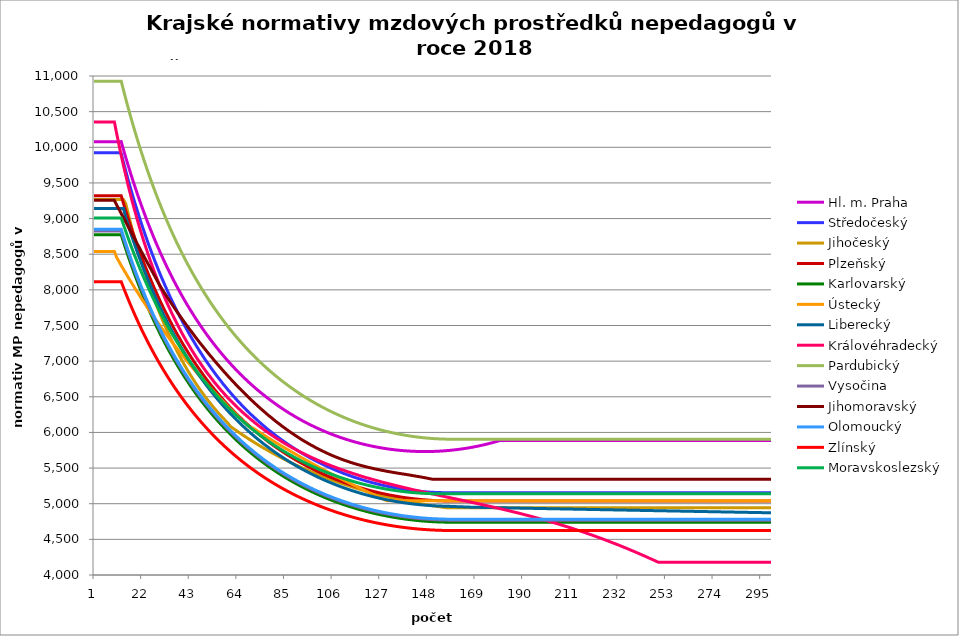
| Category | Hl. m. Praha | Středočeský | Jihočeský | Plzeňský | Karlovarský  | Ústecký   | Liberecký | Královéhradecký | Pardubický | Vysočina | Jihomoravský | Olomoucký | Zlínský | Moravskoslezský |
|---|---|---|---|---|---|---|---|---|---|---|---|---|---|---|
| 0 | 10077.971 | 9924.868 | 9267.509 | 9319.805 | 8772.707 | 8539.437 | 9142.389 | 10353.778 | 10927.718 | 8826.407 | 9255.688 | 8851.852 | 8115.046 | 9009.103 |
| 1 | 10077.971 | 9924.868 | 9267.509 | 9319.805 | 8772.707 | 8539.437 | 9142.389 | 10353.778 | 10927.718 | 8826.407 | 9255.688 | 8851.852 | 8115.046 | 9009.103 |
| 2 | 10077.971 | 9924.868 | 9267.509 | 9319.805 | 8772.707 | 8539.437 | 9142.389 | 10353.778 | 10927.718 | 8826.407 | 9255.688 | 8851.852 | 8115.046 | 9009.103 |
| 3 | 10077.971 | 9924.868 | 9267.509 | 9319.805 | 8772.707 | 8539.437 | 9142.389 | 10353.778 | 10927.718 | 8826.407 | 9255.688 | 8851.852 | 8115.046 | 9009.103 |
| 4 | 10077.971 | 9924.868 | 9267.509 | 9319.805 | 8772.707 | 8539.437 | 9142.389 | 10353.778 | 10927.718 | 8826.407 | 9255.688 | 8851.852 | 8115.046 | 9009.103 |
| 5 | 10077.971 | 9924.868 | 9267.509 | 9319.805 | 8772.707 | 8539.437 | 9142.389 | 10353.778 | 10927.718 | 8826.407 | 9255.688 | 8851.852 | 8115.046 | 9009.103 |
| 6 | 10077.971 | 9924.868 | 9267.509 | 9319.805 | 8772.707 | 8539.437 | 9142.389 | 10353.778 | 10927.718 | 8826.407 | 9255.688 | 8851.852 | 8115.046 | 9009.103 |
| 7 | 10077.971 | 9924.868 | 9267.509 | 9319.805 | 8772.707 | 8539.437 | 9142.389 | 10353.778 | 10927.718 | 8826.407 | 9255.688 | 8851.852 | 8115.046 | 9009.103 |
| 8 | 10077.971 | 9924.868 | 9267.509 | 9319.805 | 8772.707 | 8539.437 | 9142.389 | 10353.778 | 10927.718 | 8826.407 | 9255.688 | 8851.852 | 8115.046 | 9009.103 |
| 9 | 10077.971 | 9924.868 | 9267.509 | 9319.805 | 8772.707 | 8539.437 | 9142.389 | 10353.778 | 10927.718 | 8826.407 | 9255.688 | 8851.852 | 8115.046 | 9009.103 |
| 10 | 10077.971 | 9924.868 | 9267.509 | 9319.805 | 8772.707 | 8453.856 | 9142.389 | 10192.708 | 10927.718 | 8826.407 | 9189.381 | 8851.852 | 8115.046 | 9009.103 |
| 11 | 10077.971 | 9924.868 | 9267.509 | 9319.805 | 8772.707 | 8398.961 | 9142.389 | 10036.573 | 10927.718 | 8826.407 | 9131.658 | 8851.852 | 8115.046 | 9009.103 |
| 12 | 10079.675 | 9911.757 | 9267.509 | 9319.805 | 8772.785 | 8341.187 | 9142.47 | 9885.149 | 10927.815 | 8826.407 | 9070.882 | 8851.852 | 8115.046 | 9007.748 |
| 13 | 9967.203 | 9786.783 | 9267.509 | 9213.666 | 8672.115 | 8287.74 | 9142.574 | 9742.751 | 10802.416 | 8725.123 | 9010.909 | 8747.712 | 8032.29 | 8913.102 |
| 14 | 9858.029 | 9669.072 | 9210.044 | 9109.918 | 8574.398 | 8234.975 | 9013.791 | 9608.799 | 10680.694 | 8626.884 | 8951.724 | 8649.72 | 7951.757 | 8821.077 |
| 15 | 9752.018 | 9550.106 | 9078.972 | 9008.48 | 8479.512 | 8179.427 | 8913.181 | 9474.198 | 10562.5 | 8531.563 | 8889.686 | 8553.899 | 7873.363 | 8731.57 |
| 16 | 9649.044 | 9437.987 | 8952.877 | 8909.276 | 8387.343 | 8128.027 | 8815.47 | 9347.481 | 10447.689 | 8438.683 | 8832.078 | 8460.177 | 7797.03 | 8644.487 |
| 17 | 9548.987 | 9328.471 | 8831.502 | 8815.926 | 8297.781 | 8077.269 | 8720.542 | 9224.109 | 10336.127 | 8348.504 | 8771.681 | 8371.977 | 7722.683 | 8559.737 |
| 18 | 9451.733 | 9221.467 | 8714.604 | 8724.513 | 8210.725 | 8023.821 | 8628.285 | 9107.906 | 10227.686 | 8260.916 | 8712.105 | 8282.178 | 7650.251 | 8477.234 |
| 19 | 9357.174 | 9120.583 | 8601.96 | 8634.975 | 8126.077 | 7974.353 | 8538.596 | 8994.595 | 10122.244 | 8175.819 | 8649.901 | 8197.632 | 7579.666 | 8396.897 |
| 20 | 9265.209 | 9018.269 | 8493.359 | 8547.257 | 8043.745 | 7925.49 | 8451.376 | 8884.068 | 10019.687 | 8093.114 | 8591.962 | 8114.794 | 7510.864 | 8318.648 |
| 21 | 9175.74 | 8921.76 | 8388.608 | 8461.303 | 7963.641 | 7874.026 | 8366.529 | 8779.899 | 9919.905 | 8012.388 | 8531.455 | 8033.613 | 7443.783 | 8242.412 |
| 22 | 9088.676 | 8827.294 | 8287.522 | 8377.061 | 7885.682 | 7826.382 | 8283.968 | 8678.146 | 9822.795 | 7933.888 | 8471.795 | 7957.194 | 7378.364 | 8168.119 |
| 23 | 9003.928 | 8734.808 | 8189.931 | 8297.751 | 7809.788 | 7779.31 | 8203.608 | 8582.235 | 9728.259 | 7857.532 | 8412.963 | 7879.121 | 7314.552 | 8095.703 |
| 24 | 8921.414 | 8644.24 | 8095.673 | 8219.93 | 7735.886 | 7729.721 | 8125.368 | 8484.986 | 9636.202 | 7783.239 | 8354.943 | 7805.599 | 7252.293 | 8025.098 |
| 25 | 8841.054 | 8558.783 | 8004.599 | 8143.554 | 7663.903 | 7683.802 | 8049.171 | 8393.275 | 9546.537 | 7710.935 | 8297.717 | 7733.436 | 7191.536 | 7956.244 |
| 26 | 8762.773 | 8475 | 7916.567 | 8068.585 | 7593.772 | 7638.425 | 7974.944 | 8306.815 | 9459.178 | 7640.255 | 8238.156 | 7662.595 | 7132.232 | 7889.082 |
| 27 | 8686.499 | 8392.841 | 7831.445 | 7994.983 | 7525.427 | 7590.61 | 7902.619 | 8218.895 | 9374.044 | 7571.434 | 8179.445 | 7593.041 | 7074.335 | 7823.557 |
| 28 | 8612.164 | 8312.26 | 7749.107 | 7925.697 | 7458.807 | 7546.324 | 7832.129 | 8139.13 | 9291.059 | 7504.407 | 8121.564 | 7524.738 | 7017.799 | 7759.616 |
| 29 | 8539.701 | 8233.211 | 7669.435 | 7854.668 | 7393.853 | 7502.552 | 7763.411 | 8057.802 | 9210.15 | 7439.113 | 8061.516 | 7460.424 | 6962.583 | 7697.208 |
| 30 | 8469.05 | 8158.608 | 7592.32 | 7787.782 | 7330.51 | 7456.418 | 7696.406 | 7981.119 | 9131.246 | 7375.491 | 8011.168 | 7394.475 | 6908.645 | 7636.283 |
| 31 | 8400.15 | 8085.345 | 7517.656 | 7722.026 | 7268.722 | 7413.68 | 7631.055 | 7905.882 | 9054.28 | 7313.216 | 7961.446 | 7332.359 | 6855.947 | 7576.796 |
| 32 | 8332.945 | 8013.386 | 7445.345 | 7660.16 | 7208.44 | 7371.429 | 7567.303 | 7832.051 | 8979.19 | 7252.512 | 7912.337 | 7271.279 | 6804.45 | 7518.702 |
| 33 | 8267.38 | 7942.696 | 7375.293 | 7596.533 | 7149.615 | 7326.888 | 7505.1 | 7762.458 | 8905.914 | 7193.327 | 7863.83 | 7213.798 | 6754.119 | 7461.958 |
| 34 | 8203.403 | 7873.242 | 7307.413 | 7536.654 | 7092.199 | 7285.618 | 7444.394 | 7694.092 | 8834.393 | 7135.611 | 7815.914 | 7154.669 | 6704.919 | 7406.523 |
| 35 | 8140.964 | 7807.7 | 7241.62 | 7475.053 | 7036.147 | 7244.81 | 7385.138 | 7626.919 | 8764.573 | 7079.318 | 7768.579 | 7099.01 | 6656.817 | 7352.359 |
| 36 | 8080.017 | 7740.578 | 7177.838 | 7417.066 | 6981.418 | 7201.782 | 7327.286 | 7563.636 | 8696.4 | 7024.153 | 7721.813 | 7044.211 | 6609.782 | 7299.426 |
| 37 | 8020.515 | 7677.217 | 7115.989 | 7359.972 | 6927.97 | 7161.905 | 7270.795 | 7501.395 | 8629.822 | 6970.329 | 7675.607 | 6990.251 | 6563.782 | 7247.691 |
| 38 | 7962.415 | 7617.462 | 7056.005 | 7306.287 | 6875.764 | 7122.467 | 7215.623 | 7440.17 | 8564.792 | 6917.804 | 7629.951 | 6937.111 | 6518.789 | 7197.117 |
| 39 | 7905.674 | 7556.093 | 6997.817 | 7250.879 | 6824.762 | 7080.876 | 7161.728 | 7379.937 | 8501.261 | 6866.538 | 7584.835 | 6884.774 | 6474.774 | 7147.672 |
| 40 | 7850.254 | 7495.704 | 6941.361 | 7198.768 | 6774.929 | 7042.323 | 7109.074 | 7323.227 | 8439.186 | 6816.493 | 7540.249 | 6835.546 | 6431.71 | 7099.323 |
| 41 | 7796.115 | 7438.731 | 6886.578 | 7147.401 | 6726.229 | 7001.66 | 7057.623 | 7267.383 | 8378.524 | 6767.402 | 7496.184 | 6787.018 | 6389.572 | 7052.041 |
| 42 | 7743.221 | 7382.617 | 6833.41 | 7096.761 | 6678.63 | 6963.963 | 7007.339 | 7214.866 | 8319.232 | 6719.466 | 7455.179 | 6736.913 | 6348.333 | 7005.795 |
| 43 | 7691.536 | 7327.344 | 6781.803 | 7046.834 | 6632.099 | 6926.669 | 6958.189 | 7160.656 | 8261.271 | 6672.651 | 7412.101 | 6692 | 6307.971 | 6960.557 |
| 44 | 7641.026 | 7275.242 | 6731.703 | 6997.605 | 6586.607 | 6887.327 | 6910.141 | 7109.664 | 8204.604 | 6626.925 | 7369.517 | 6645.482 | 6268.461 | 6916.3 |
| 45 | 7591.658 | 7221.559 | 6683.062 | 6951.355 | 6542.124 | 6850.847 | 6863.162 | 7059.394 | 8149.193 | 6582.257 | 7327.419 | 6599.606 | 6229.781 | 6872.998 |
| 46 | 7543.402 | 7170.946 | 6635.833 | 6905.712 | 6498.622 | 6814.752 | 6817.223 | 7012.174 | 8095.004 | 6538.401 | 7285.8 | 6556.499 | 6191.911 | 6830.625 |
| 47 | 7496.227 | 7121.038 | 6589.97 | 6860.665 | 6456.073 | 6776.668 | 6772.295 | 6965.581 | 8042.003 | 6495.549 | 7244.651 | 6513.952 | 6154.828 | 6789.157 |
| 48 | 7450.103 | 7071.819 | 6545.432 | 6816.202 | 6414.451 | 6741.348 | 6728.351 | 6919.604 | 7990.158 | 6453.674 | 7206.345 | 6471.954 | 6118.514 | 6748.571 |
| 49 | 7405.004 | 7023.276 | 6502.177 | 6772.312 | 6373.732 | 6706.395 | 6685.363 | 6874.23 | 7939.437 | 6412.747 | 7166.086 | 6430.493 | 6082.948 | 6708.844 |
| 50 | 7360.902 | 6977.557 | 6460.166 | 6728.983 | 6333.892 | 6669.508 | 6643.305 | 6831.672 | 7889.809 | 6372.745 | 7126.275 | 6389.561 | 6048.112 | 6669.955 |
| 51 | 7317.772 | 6932.43 | 6419.363 | 6688.331 | 6294.907 | 6635.294 | 6602.154 | 6789.637 | 7841.247 | 6333.439 | 7086.903 | 6351.155 | 6013.988 | 6631.882 |
| 52 | 7275.588 | 6887.882 | 6379.731 | 6648.167 | 6256.754 | 6601.429 | 6561.885 | 6748.117 | 7793.723 | 6295.014 | 7050.242 | 6313.208 | 5980.56 | 6594.605 |
| 53 | 7234.327 | 6843.904 | 6341.238 | 6608.483 | 6219.413 | 6565.685 | 6522.475 | 6707.102 | 7747.209 | 6257.444 | 7011.704 | 6275.711 | 5947.809 | 6558.105 |
| 54 | 7193.965 | 6800.483 | 6303.85 | 6569.269 | 6182.863 | 6532.525 | 6483.903 | 6668.702 | 7701.68 | 6220.709 | 6973.585 | 6238.658 | 5915.721 | 6522.363 |
| 55 | 7154.48 | 6759.64 | 6267.538 | 6532.547 | 6147.083 | 6499.698 | 6446.146 | 6630.74 | 7657.111 | 6184.787 | 6938.085 | 6202.039 | 5884.278 | 6487.361 |
| 56 | 7115.851 | 6719.284 | 6232.271 | 6494.227 | 6112.054 | 6465.045 | 6409.185 | 6593.208 | 7613.477 | 6149.468 | 6900.759 | 6165.848 | 5853.468 | 6453.081 |
| 57 | 7078.058 | 6677.425 | 6198.021 | 6458.336 | 6077.758 | 6432.891 | 6373 | 6558.148 | 7570.757 | 6114.924 | 6863.834 | 6131.949 | 5823.273 | 6419.507 |
| 58 | 7041.08 | 6640 | 6164.762 | 6422.84 | 6044.177 | 6401.056 | 6337.571 | 6521.431 | 7528.926 | 6081.138 | 6829.439 | 6098.42 | 5793.682 | 6386.621 |
| 59 | 7004.897 | 6601.056 | 6132.468 | 6387.732 | 6011.294 | 6367.443 | 6302.881 | 6487.129 | 7487.965 | 6048.09 | 6793.271 | 6065.257 | 5764.68 | 6354.409 |
| 60 | 6969.492 | 6564.479 | 6088.277 | 6353.005 | 5979.091 | 6336.251 | 6268.911 | 6455.172 | 7447.852 | 6015.763 | 6759.578 | 6032.452 | 5736.253 | 6322.854 |
| 61 | 6934.847 | 6526.413 | 6065.288 | 6320.553 | 5947.553 | 6305.362 | 6235.645 | 6421.562 | 7408.567 | 5983.96 | 6724.144 | 6000 | 5708.39 | 6291.943 |
| 62 | 6900.944 | 6490.657 | 6042.645 | 6286.551 | 5916.665 | 6272.745 | 6203.065 | 6390.247 | 7370.09 | 5952.846 | 6691.132 | 5969.67 | 5681.077 | 6261.661 |
| 63 | 6867.766 | 6455.291 | 6020.342 | 6254.773 | 5886.41 | 6242.471 | 6171.156 | 6359.236 | 7332.404 | 5922.407 | 6656.41 | 5939.645 | 5654.304 | 6231.994 |
| 64 | 6835.298 | 6422.14 | 5998.374 | 6223.314 | 5856.775 | 6212.488 | 6139.903 | 6328.524 | 7295.489 | 5892.626 | 6624.058 | 5908.181 | 5628.058 | 6202.929 |
| 65 | 6803.524 | 6387.514 | 5976.735 | 6192.17 | 5827.746 | 6180.822 | 6109.29 | 6298.108 | 7259.329 | 5863.488 | 6592.019 | 5878.77 | 5602.328 | 6174.453 |
| 66 | 6772.428 | 6355.054 | 5955.42 | 6161.336 | 5799.309 | 6151.427 | 6079.303 | 6269.856 | 7223.906 | 5834.808 | 6560.289 | 5851.355 | 5577.104 | 6146.554 |
| 67 | 6741.997 | 6322.921 | 5934.423 | 6132.595 | 5771.451 | 6122.31 | 6049.929 | 6241.858 | 7189.204 | 5806.745 | 6528.862 | 5822.506 | 5552.375 | 6119.219 |
| 68 | 6712.216 | 6291.112 | 5913.74 | 6104.121 | 5744.159 | 6091.554 | 6021.153 | 6214.108 | 7155.208 | 5779.286 | 6497.735 | 5795.612 | 5528.13 | 6092.437 |
| 69 | 6683.071 | 6259.622 | 5893.366 | 6075.91 | 5717.421 | 6063 | 5992.963 | 6186.604 | 7121.902 | 5752.418 | 6466.904 | 5768.966 | 5504.361 | 6066.196 |
| 70 | 6654.55 | 6230.169 | 5873.295 | 6047.959 | 5691.225 | 6063 | 5965.346 | 6161.152 | 7089.272 | 5726.128 | 6436.364 | 5742.563 | 5481.057 | 6040.486 |
| 71 | 6626.64 | 6200.992 | 5853.523 | 6020.263 | 5665.56 | 6042.23 | 5938.29 | 6134.114 | 7057.302 | 5700.24 | 6406.11 | 5716.401 | 5458.21 | 6015.295 |
| 72 | 6599.328 | 6172.087 | 5834.045 | 5992.821 | 5640.415 | 6021.601 | 5911.784 | 6109.091 | 7025.98 | 5674.909 | 6378.005 | 5690.476 | 5435.81 | 5990.615 |
| 73 | 6572.603 | 6143.45 | 5814.856 | 5967.319 | 5615.779 | 6001.114 | 5885.815 | 6084.272 | 6995.292 | 5650.122 | 6348.297 | 5666.384 | 5413.849 | 5966.434 |
| 74 | 6546.453 | 6115.077 | 5795.953 | 5942.034 | 5591.641 | 5980.764 | 5860.372 | 6061.405 | 6965.224 | 5625.868 | 6320.696 | 5640.91 | 5392.318 | 5942.743 |
| 75 | 6520.867 | 6088.612 | 5777.331 | 5916.962 | 5567.991 | 5960.553 | 5835.446 | 6036.971 | 6935.766 | 5602.137 | 6293.333 | 5617.236 | 5371.209 | 5919.533 |
| 76 | 6495.834 | 6060.743 | 5758.985 | 5892.101 | 5544.821 | 5940.478 | 5811.026 | 6014.458 | 6906.903 | 5578.762 | 6264.407 | 5593.759 | 5350.515 | 5896.794 |
| 77 | 6471.344 | 6034.745 | 5740.912 | 5867.448 | 5522.119 | 5920.537 | 5787.101 | 5992.112 | 6878.625 | 5555.89 | 6237.529 | 5570.477 | 5330.227 | 5874.519 |
| 78 | 6447.387 | 6010.574 | 5723.107 | 5844.624 | 5499.878 | 5900.73 | 5763.662 | 5969.932 | 6850.92 | 5533.513 | 6212.65 | 5548.922 | 5310.338 | 5852.698 |
| 79 | 6423.952 | 5985.004 | 5705.567 | 5820.365 | 5478.088 | 5881.055 | 5740.7 | 5949.603 | 6823.777 | 5511.62 | 6186.213 | 5527.533 | 5290.842 | 5831.323 |
| 80 | 6401.031 | 5959.651 | 5688.287 | 5797.905 | 5456.74 | 5861.511 | 5718.205 | 5927.735 | 6797.186 | 5490.203 | 6160 | 5504.798 | 5271.731 | 5810.386 |
| 81 | 6378.614 | 5936.076 | 5671.265 | 5775.618 | 5435.827 | 5842.096 | 5696.169 | 5907.692 | 6771.135 | 5469.101 | 6135.734 | 5483.748 | 5252.997 | 5789.88 |
| 82 | 6356.693 | 5912.687 | 5654.496 | 5755.075 | 5415.34 | 5822.809 | 5674.583 | 5887.784 | 6745.616 | 5448.459 | 6111.659 | 5462.857 | 5234.636 | 5769.796 |
| 83 | 6335.258 | 5889.482 | 5637.976 | 5733.115 | 5395.272 | 5803.649 | 5653.438 | 5868.01 | 6720.617 | 5428.268 | 6086.073 | 5443.601 | 5216.64 | 5750.128 |
| 84 | 6314.303 | 5867.987 | 5621.703 | 5712.873 | 5375.614 | 5784.615 | 5632.728 | 5848.368 | 6696.131 | 5408.52 | 6064.071 | 5423.015 | 5199.002 | 5730.869 |
| 85 | 6293.817 | 5845.131 | 5605.672 | 5691.234 | 5356.36 | 5767.42 | 5612.443 | 5830.478 | 6672.147 | 5389.206 | 6040.554 | 5404.038 | 5181.718 | 5712.012 |
| 86 | 6273.794 | 5823.959 | 5589.881 | 5671.286 | 5337.503 | 5748.622 | 5592.577 | 5811.086 | 6648.657 | 5370.175 | 6017.219 | 5385.193 | 5164.781 | 5693.549 |
| 87 | 6254.227 | 5802.939 | 5574.326 | 5651.478 | 5319.035 | 5729.947 | 5573.122 | 5793.424 | 6625.653 | 5351.565 | 5995.711 | 5366.48 | 5148.186 | 5675.476 |
| 88 | 6235.107 | 5782.07 | 5559.004 | 5633.315 | 5300.949 | 5711.392 | 5554.07 | 5775.868 | 6603.125 | 5333.369 | 5974.356 | 5347.896 | 5131.926 | 5657.784 |
| 89 | 6216.428 | 5761.351 | 5543.912 | 5613.771 | 5283.24 | 5692.958 | 5535.416 | 5760 | 6581.066 | 5315.58 | 5953.153 | 5330.855 | 5115.998 | 5640.469 |
| 90 | 6198.182 | 5742.245 | 5529.046 | 5595.85 | 5265.901 | 5674.642 | 5517.153 | 5742.646 | 6559.467 | 5298.191 | 5932.1 | 5312.517 | 5100.394 | 5623.524 |
| 91 | 6180.364 | 5723.265 | 5514.405 | 5578.043 | 5248.926 | 5656.443 | 5499.273 | 5725.396 | 6538.322 | 5281.056 | 5911.195 | 5295.7 | 5085.112 | 5606.944 |
| 92 | 6162.967 | 5702.964 | 5499.984 | 5560.349 | 5232.309 | 5638.361 | 5481.771 | 5709.804 | 6517.623 | 5264.309 | 5892.029 | 5278.99 | 5070.144 | 5590.723 |
| 93 | 6145.984 | 5685.678 | 5485.781 | 5542.767 | 5216.044 | 5620.394 | 5464.64 | 5694.297 | 6497.363 | 5247.945 | 5872.987 | 5262.385 | 5055.488 | 5574.856 |
| 94 | 6129.41 | 5667.069 | 5471.793 | 5525.296 | 5200.126 | 5602.541 | 5447.875 | 5678.873 | 6477.534 | 5231.957 | 5854.067 | 5245.885 | 5041.137 | 5559.337 |
| 95 | 6113.239 | 5648.582 | 5458.018 | 5509.377 | 5184.549 | 5584.801 | 5431.47 | 5663.533 | 6458.131 | 5216.339 | 5835.269 | 5230.849 | 5027.089 | 5544.162 |
| 96 | 6097.464 | 5631.624 | 5444.453 | 5493.549 | 5169.308 | 5567.174 | 5415.419 | 5648.276 | 6439.146 | 5200.95 | 5818.143 | 5215.9 | 5013.337 | 5529.326 |
| 97 | 6082.081 | 5614.767 | 5431.095 | 5477.812 | 5154.398 | 5549.657 | 5399.717 | 5634.614 | 6420.573 | 5185.922 | 5801.117 | 5199.689 | 4999.879 | 5514.823 |
| 98 | 6067.084 | 5598.01 | 5417.941 | 5462.166 | 5139.813 | 5532.25 | 5384.359 | 5619.512 | 6402.406 | 5171.248 | 5782.657 | 5184.917 | 4986.709 | 5500.649 |
| 99 | 6052.468 | 5582.738 | 5404.99 | 5446.608 | 5125.55 | 5514.952 | 5369.339 | 5605.989 | 6384.639 | 5156.925 | 5767.363 | 5171.561 | 4973.825 | 5486.8 |
| 100 | 6038.229 | 5566.172 | 5392.238 | 5431.139 | 5111.603 | 5497.761 | 5354.653 | 5592.531 | 6367.266 | 5142.946 | 5750.633 | 5156.948 | 4961.222 | 5473.272 |
| 101 | 6024.36 | 5551.073 | 5379.684 | 5417.152 | 5097.969 | 5480.678 | 5340.296 | 5579.138 | 6350.282 | 5129.174 | 5735.508 | 5143.736 | 4948.896 | 5460.059 |
| 102 | 6010.859 | 5536.055 | 5367.325 | 5403.237 | 5084.641 | 5463.7 | 5326.264 | 5565.808 | 6333.681 | 5115.739 | 5720.462 | 5129.28 | 4936.843 | 5447.159 |
| 103 | 5997.719 | 5521.118 | 5355.159 | 5389.393 | 5071.617 | 5446.828 | 5312.551 | 5552.542 | 6317.458 | 5102.636 | 5705.495 | 5116.208 | 4925.061 | 5434.567 |
| 104 | 5984.937 | 5506.262 | 5343.183 | 5375.62 | 5058.893 | 5430.059 | 5299.153 | 5540.803 | 6301.607 | 5089.859 | 5690.605 | 5104.5 | 4913.546 | 5422.278 |
| 105 | 5972.509 | 5492.826 | 5331.395 | 5363.284 | 5046.463 | 5413.393 | 5286.066 | 5527.656 | 6286.124 | 5077.405 | 5677.272 | 5091.555 | 4902.293 | 5410.291 |
| 106 | 5960.43 | 5478.121 | 5319.793 | 5349.644 | 5034.325 | 5396.829 | 5273.287 | 5516.022 | 6271.004 | 5065.141 | 5664 | 5078.674 | 4891.301 | 5398.6 |
| 107 | 5948.697 | 5464.822 | 5308.376 | 5337.427 | 5022.474 | 5380.366 | 5260.81 | 5504.437 | 6256.242 | 5053.192 | 5650.79 | 5067.138 | 4880.566 | 5387.203 |
| 108 | 5937.306 | 5451.586 | 5297.14 | 5325.266 | 5010.908 | 5364.003 | 5248.633 | 5491.461 | 6241.834 | 5041.555 | 5639.1 | 5055.653 | 4870.085 | 5376.095 |
| 109 | 5926.253 | 5439.729 | 5286.085 | 5313.16 | 4999.621 | 5347.74 | 5236.751 | 5479.979 | 6227.776 | 5030.225 | 5626.006 | 5044.221 | 4859.854 | 5365.274 |
| 110 | 5915.535 | 5426.615 | 5275.208 | 5301.109 | 4988.612 | 5331.575 | 5225.161 | 5469.971 | 6214.062 | 5019.199 | 5614.418 | 5032.84 | 4849.872 | 5354.737 |
| 111 | 5905.148 | 5414.866 | 5264.507 | 5290.443 | 4977.876 | 5315.507 | 5213.86 | 5458.578 | 6200.689 | 5008.347 | 5602.878 | 5022.767 | 4840.135 | 5344.48 |
| 112 | 5895.089 | 5403.169 | 5253.98 | 5278.494 | 4967.411 | 5299.536 | 5202.843 | 5447.233 | 6187.653 | 4997.792 | 5592.819 | 5011.483 | 4830.641 | 5334.501 |
| 113 | 5885.354 | 5391.521 | 5243.625 | 5267.919 | 4957.213 | 5283.66 | 5192.108 | 5437.344 | 6174.949 | 4987.532 | 5581.367 | 5001.495 | 4821.386 | 5324.796 |
| 114 | 5875.941 | 5379.924 | 5233.442 | 5257.386 | 4948.515 | 5267.879 | 5181.651 | 5426.087 | 6162.575 | 4977.562 | 5571.385 | 4991.546 | 4812.369 | 5315.363 |
| 115 | 5866.847 | 5369.656 | 5223.427 | 5246.894 | 4937.607 | 5253.615 | 5171.47 | 5416.275 | 6150.527 | 4967.88 | 5561.438 | 4981.638 | 4803.587 | 5306.199 |
| 116 | 5858.07 | 5359.429 | 5213.579 | 5236.445 | 4928.193 | 5238.013 | 5161.561 | 5406.498 | 6138.801 | 4958.359 | 5551.527 | 4971.768 | 4795.037 | 5297.302 |
| 117 | 5849.605 | 5349.24 | 5203.897 | 5227.336 | 4919.035 | 5222.503 | 5151.921 | 5395.368 | 6127.393 | 4949.121 | 5543.06 | 4963.164 | 4786.717 | 5288.668 |
| 118 | 5841.451 | 5339.089 | 5194.379 | 5218.258 | 4910.13 | 5207.085 | 5142.548 | 5385.667 | 6116.301 | 4940.161 | 5534.619 | 4953.368 | 4778.626 | 5280.296 |
| 119 | 5833.605 | 5328.977 | 5185.024 | 5209.212 | 4901.475 | 5191.758 | 5133.439 | 5376 | 6105.52 | 4931.478 | 5526.204 | 4944.828 | 4770.76 | 5272.183 |
| 120 | 5826.065 | 5320.161 | 5175.829 | 5200.198 | 4893.069 | 5176.521 | 5124.591 | 5366.368 | 6095.049 | 4923.069 | 5517.814 | 4936.317 | 4763.118 | 5264.327 |
| 121 | 5818.829 | 5310.12 | 5166.793 | 5191.214 | 4884.909 | 5161.373 | 5116.002 | 5358.14 | 6084.884 | 4914.81 | 5509.449 | 4927.835 | 4755.698 | 5256.726 |
| 122 | 5811.894 | 5301.366 | 5157.915 | 5182.262 | 4876.991 | 5146.313 | 5107.669 | 5348.571 | 6075.022 | 4906.82 | 5502.498 | 4920.588 | 4748.497 | 5249.377 |
| 123 | 5805.258 | 5292.64 | 5149.193 | 5174.613 | 4869.315 | 5131.341 | 5099.591 | 5339.037 | 6065.46 | 4899.097 | 5495.565 | 4912.161 | 4741.515 | 5242.279 |
| 124 | 5798.919 | 5285.184 | 5140.626 | 5166.986 | 4861.878 | 5116.456 | 5091.763 | 5330.892 | 6056.196 | 4891.639 | 5487.267 | 4904.96 | 4734.748 | 5235.429 |
| 125 | 5792.876 | 5276.512 | 5132.212 | 5159.382 | 4854.678 | 5101.657 | 5084.186 | 5321.421 | 6047.228 | 4884.443 | 5481.75 | 4897.78 | 4728.196 | 5228.827 |
| 126 | 5787.126 | 5269.101 | 5123.951 | 5151.8 | 4847.713 | 5086.943 | 5076.855 | 5313.33 | 6038.551 | 4877.387 | 5474.868 | 4890.621 | 4721.856 | 5222.469 |
| 127 | 5781.668 | 5261.711 | 5115.84 | 5144.241 | 4840.981 | 5072.314 | 5069.77 | 5303.921 | 6030.166 | 4870.59 | 5468.004 | 4883.483 | 4715.727 | 5216.354 |
| 128 | 5776.5 | 5254.342 | 5107.878 | 5137.958 | 4834.48 | 5057.769 | 5062.929 | 5295.883 | 6022.068 | 4864.049 | 5462.525 | 4877.551 | 4709.808 | 5210.481 |
| 129 | 5771.621 | 5246.993 | 5100.065 | 5130.439 | 4828.208 | 5043.306 | 5056.329 | 5287.869 | 6014.255 | 4857.763 | 5455.692 | 4871.633 | 4704.096 | 5204.848 |
| 130 | 5767.029 | 5240.885 | 5092.399 | 5124.19 | 4822.164 | 5043.306 | 5049.968 | 5279.879 | 6006.727 | 4851.729 | 5450.237 | 4864.551 | 4698.591 | 5199.454 |
| 131 | 5762.723 | 5233.574 | 5084.878 | 5117.956 | 4816.346 | 5043.306 | 5043.845 | 5271.914 | 5999.479 | 4845.828 | 5444.794 | 4858.664 | 4693.291 | 5194.296 |
| 132 | 5758.701 | 5227.497 | 5077.502 | 5112.98 | 4810.753 | 5043.306 | 5037.959 | 5263.972 | 5992.512 | 4840.177 | 5439.361 | 4853.965 | 4688.194 | 5189.374 |
| 133 | 5754.963 | 5221.434 | 5070.269 | 5106.773 | 4805.382 | 5043.306 | 5032.307 | 5256.054 | 5985.822 | 4834.773 | 5433.94 | 4848.104 | 4683.3 | 5184.687 |
| 134 | 5751.508 | 5216.593 | 5063.179 | 5101.819 | 4800.233 | 5043.306 | 5026.888 | 5248.16 | 5979.407 | 4829.616 | 5428.529 | 4843.426 | 4678.607 | 5180.233 |
| 135 | 5748.334 | 5210.556 | 5056.229 | 5095.64 | 4795.304 | 5043.306 | 5021.701 | 5240.29 | 5973.267 | 4824.703 | 5423.129 | 4837.59 | 4674.114 | 5176.01 |
| 136 | 5745.44 | 5205.735 | 5049.42 | 5090.707 | 4790.593 | 5043.306 | 5016.744 | 5232.443 | 5967.4 | 4819.917 | 5417.739 | 4832.932 | 4669.82 | 5172.019 |
| 137 | 5742.825 | 5200.924 | 5042.749 | 5085.783 | 4786.1 | 5043.306 | 5012.016 | 5224.62 | 5961.803 | 4815.373 | 5413.704 | 4828.283 | 4665.723 | 5168.257 |
| 138 | 5740.49 | 5196.122 | 5036.217 | 5082.097 | 4781.823 | 5043.306 | 5007.516 | 5218.118 | 5956.476 | 4811.071 | 5408.333 | 4824.802 | 4661.823 | 5164.724 |
| 139 | 5738.433 | 5191.328 | 5029.821 | 5077.19 | 4777.762 | 5043.306 | 5003.242 | 5210.338 | 5951.416 | 4807.007 | 5402.973 | 4820.168 | 4658.119 | 5161.418 |
| 140 | 5736.653 | 5187.739 | 5023.561 | 5073.517 | 4773.914 | 5043.306 | 4999.194 | 5202.581 | 5946.624 | 4803.183 | 5397.624 | 4816.699 | 4654.61 | 5158.34 |
| 141 | 5735.15 | 5184.155 | 5017.437 | 5069.848 | 4770.28 | 5043.306 | 4995.369 | 5194.846 | 5942.096 | 4799.48 | 5392.285 | 4813.234 | 4651.295 | 5155.488 |
| 142 | 5733.924 | 5179.383 | 5011.446 | 5066.185 | 4766.857 | 5043.306 | 4991.768 | 5188.419 | 5937.833 | 4796.013 | 5386.957 | 4809.775 | 4648.173 | 5152.862 |
| 143 | 5732.974 | 5177.001 | 5005.589 | 5062.527 | 4763.646 | 5043.306 | 4988.389 | 5180.726 | 5933.833 | 4792.782 | 5381.639 | 4806.32 | 4645.243 | 5150.46 |
| 144 | 5732.3 | 5173.431 | 4999.864 | 5058.874 | 4760.645 | 5043.306 | 4985.231 | 5174.334 | 5930.095 | 4789.786 | 5376.331 | 4802.871 | 4642.505 | 5148.282 |
| 145 | 5731.902 | 5169.867 | 4994.27 | 5056.442 | 4757.854 | 5043.306 | 4982.294 | 5166.683 | 5926.618 | 4787.024 | 5369.712 | 4800.574 | 4639.958 | 5146.328 |
| 146 | 5731.78 | 5167.493 | 4988.807 | 5054.012 | 4755.272 | 5043.306 | 4979.577 | 5160.325 | 5923.402 | 4784.38 | 5364.428 | 4797.133 | 4637.602 | 5144.596 |
| 147 | 5731.933 | 5165.122 | 4983.473 | 5051.585 | 4752.897 | 5043.306 | 4977.079 | 5152.716 | 5920.444 | 4781.968 | 5357.838 | 4794.841 | 4635.435 | 5143.088 |
| 148 | 5732.362 | 5162.752 | 4978.269 | 5049.16 | 4750.731 | 5043.306 | 4974.799 | 5146.392 | 5917.745 | 4779.788 | 5351.264 | 4792.552 | 4633.457 | 5141.802 |
| 149 | 5733.066 | 5160.385 | 4973.193 | 5046.737 | 4748.771 | 5043.306 | 4972.737 | 5138.824 | 5915.304 | 4777.839 | 5344.706 | 4791.408 | 4631.669 | 5140.737 |
| 150 | 5734.047 | 5159.202 | 4968.244 | 5044.317 | 4747.018 | 5043.306 | 4970.892 | 5132.534 | 5913.12 | 4776.121 | 5344.706 | 4789.122 | 4630.068 | 5139.894 |
| 151 | 5735.304 | 5158.02 | 4963.422 | 5043.107 | 4745.47 | 5043.306 | 4969.264 | 5125.006 | 5911.193 | 4774.518 | 5344.706 | 4787.98 | 4628.656 | 5139.273 |
| 152 | 5736.837 | 5155.657 | 4958.726 | 5041.898 | 4744.129 | 5043.306 | 4967.852 | 5118.75 | 5909.521 | 4773.145 | 5344.706 | 4786.838 | 4627.431 | 5138.872 |
| 153 | 5738.648 | 5155.657 | 4954.155 | 5040.69 | 4742.992 | 5043.306 | 4966.656 | 5111.263 | 5908.106 | 4772.002 | 5344.706 | 4785.697 | 4626.394 | 5138.693 |
| 154 | 5740.736 | 5154.477 | 4949.709 | 5039.483 | 4742.061 | 5043.306 | 4965.676 | 5105.04 | 5906.945 | 4771.088 | 5344.706 | 4784.557 | 4625.544 | 5138.195 |
| 155 | 5743.102 | 5153.297 | 4945.387 | 5039.483 | 4741.334 | 5043.306 | 4964.912 | 5097.593 | 5906.04 | 4770.402 | 5344.706 | 4783.417 | 4624.88 | 5138.195 |
| 156 | 5745.747 | 5153.297 | 4942.671 | 5038.275 | 4740.812 | 5043.306 | 4964.362 | 5091.404 | 5905.39 | 4769.831 | 5344.706 | 4783.417 | 4624.403 | 5138.195 |
| 157 | 5748.672 | 5153.297 | 4942.671 | 5038.275 | 4740.494 | 5043.306 | 4962.571 | 5083.996 | 5904.994 | 4769.489 | 5344.706 | 4782.277 | 4624.113 | 5138.195 |
| 158 | 5751.878 | 5153.297 | 4942.671 | 5038.275 | 4740.38 | 5043.306 | 4961.378 | 5077.84 | 5904.852 | 4769.374 | 5344.706 | 4782.277 | 4624.01 | 5138.195 |
| 159 | 5755.365 | 5153.297 | 4942.671 | 5038.275 | 4740.471 | 5043.306 | 4960.185 | 5070.472 | 5904.683 | 4769.26 | 5344.706 | 4782.277 | 4624.01 | 5138.195 |
| 160 | 5759.134 | 5153.297 | 4942.671 | 5038.275 | 4740.244 | 5043.306 | 4958.993 | 5064.348 | 5904.683 | 4769.26 | 5344.706 | 4782.277 | 4624.01 | 5138.195 |
| 161 | 5763.187 | 5153.297 | 4942.671 | 5038.275 | 4740.244 | 5043.306 | 4957.802 | 5057.019 | 5904.683 | 4769.26 | 5344.706 | 4782.277 | 4624.01 | 5138.195 |
| 162 | 5767.525 | 5153.297 | 4942.671 | 5038.275 | 4740.244 | 5043.306 | 4956.611 | 5050.927 | 5904.683 | 4769.26 | 5344.706 | 4782.277 | 4624.01 | 5138.195 |
| 163 | 5772.149 | 5153.297 | 4942.671 | 5038.275 | 4740.244 | 5043.306 | 4955.421 | 5043.637 | 5904.683 | 4769.26 | 5344.706 | 4782.277 | 4624.01 | 5138.195 |
| 164 | 5777.06 | 5153.297 | 4942.671 | 5038.275 | 4740.244 | 5043.306 | 4954.231 | 5037.578 | 5904.683 | 4769.26 | 5344.706 | 4782.277 | 4624.01 | 5138.195 |
| 165 | 5782.26 | 5153.297 | 4942.671 | 5038.275 | 4740.244 | 5043.306 | 4953.042 | 5030.326 | 5904.683 | 4769.26 | 5344.706 | 4782.277 | 4624.01 | 5138.195 |
| 166 | 5787.75 | 5153.297 | 4942.671 | 5038.275 | 4740.244 | 5043.306 | 4951.853 | 5023.095 | 5904.683 | 4769.26 | 5344.706 | 4782.277 | 4624.01 | 5138.195 |
| 167 | 5793.532 | 5153.297 | 4942.671 | 5038.275 | 4740.244 | 5043.306 | 4950.665 | 5015.885 | 5904.683 | 4769.26 | 5344.706 | 4782.277 | 4624.01 | 5138.195 |
| 168 | 5799.609 | 5153.297 | 4942.671 | 5038.275 | 4740.244 | 5043.306 | 4950.665 | 5009.892 | 5904.683 | 4769.26 | 5344.706 | 4782.277 | 4624.01 | 5138.195 |
| 169 | 5805.98 | 5153.297 | 4942.671 | 5038.275 | 4740.244 | 5043.306 | 4949.477 | 5002.72 | 5904.683 | 4769.26 | 5344.706 | 4782.277 | 4624.01 | 5138.195 |
| 170 | 5812.649 | 5153.297 | 4942.671 | 5038.275 | 4740.244 | 5043.306 | 4948.833 | 4995.568 | 5904.683 | 4769.26 | 5344.706 | 4782.277 | 4624.01 | 5138.195 |
| 171 | 5819.618 | 5153.297 | 4942.671 | 5038.275 | 4740.244 | 5043.306 | 4948.23 | 4988.437 | 5904.683 | 4769.26 | 5344.706 | 4782.277 | 4624.01 | 5138.195 |
| 172 | 5826.888 | 5153.297 | 4942.671 | 5038.275 | 4740.244 | 5043.306 | 4947.628 | 4981.326 | 5904.683 | 4769.26 | 5344.706 | 4782.277 | 4624.01 | 5138.195 |
| 173 | 5834.462 | 5153.297 | 4942.671 | 5038.275 | 4740.244 | 5043.306 | 4947.026 | 4974.235 | 5904.683 | 4769.26 | 5344.706 | 4782.277 | 4624.01 | 5138.195 |
| 174 | 5842.342 | 5153.297 | 4942.671 | 5038.275 | 4740.244 | 5043.306 | 4946.424 | 4967.164 | 5904.683 | 4769.26 | 5344.706 | 4782.277 | 4624.01 | 5138.195 |
| 175 | 5850.53 | 5153.297 | 4942.671 | 5038.275 | 4740.244 | 5043.306 | 4945.822 | 4960.114 | 5904.683 | 4769.26 | 5344.706 | 4782.277 | 4624.01 | 5138.195 |
| 176 | 5859.029 | 5153.297 | 4942.671 | 5038.275 | 4740.244 | 5043.306 | 4945.22 | 4953.083 | 5904.683 | 4769.26 | 5344.706 | 4782.277 | 4624.01 | 5138.195 |
| 177 | 5867.842 | 5153.297 | 4942.671 | 5038.275 | 4740.244 | 5043.306 | 4944.619 | 4946.072 | 5904.683 | 4769.26 | 5344.706 | 4782.277 | 4624.01 | 5138.195 |
| 178 | 5876.971 | 5153.297 | 4942.671 | 5038.275 | 4740.244 | 5043.306 | 4944.017 | 4937.918 | 5904.683 | 4769.26 | 5344.706 | 4782.277 | 4624.01 | 5138.195 |
| 179 | 5886.42 | 5153.297 | 4942.671 | 5038.275 | 4740.244 | 5043.306 | 4943.416 | 4930.95 | 5904.683 | 4769.26 | 5344.706 | 4782.277 | 4624.01 | 5138.195 |
| 180 | 5886.42 | 5153.297 | 4942.671 | 5038.275 | 4740.244 | 5043.306 | 4942.815 | 4924.002 | 5904.683 | 4769.26 | 5344.706 | 4782.277 | 4624.01 | 5138.195 |
| 181 | 5886.42 | 5153.297 | 4942.671 | 5038.275 | 4740.244 | 5043.306 | 4942.214 | 4915.92 | 5904.683 | 4769.26 | 5344.706 | 4782.277 | 4624.01 | 5138.195 |
| 182 | 5886.42 | 5153.297 | 4942.671 | 5038.275 | 4740.244 | 5043.306 | 4941.613 | 4909.014 | 5904.683 | 4769.26 | 5344.706 | 4782.277 | 4624.01 | 5138.195 |
| 183 | 5886.42 | 5153.297 | 4942.671 | 5038.275 | 4740.244 | 5043.306 | 4941.013 | 4900.982 | 5904.683 | 4769.26 | 5344.706 | 4782.277 | 4624.01 | 5138.195 |
| 184 | 5886.42 | 5153.297 | 4942.671 | 5038.275 | 4740.244 | 5043.306 | 4940.412 | 4892.975 | 5904.683 | 4769.26 | 5344.706 | 4782.277 | 4624.01 | 5138.195 |
| 185 | 5886.42 | 5153.297 | 4942.671 | 5038.275 | 4740.244 | 5043.306 | 4939.812 | 4884.995 | 5904.683 | 4769.26 | 5344.706 | 4782.277 | 4624.01 | 5138.195 |
| 186 | 5886.42 | 5153.297 | 4942.671 | 5038.275 | 4740.244 | 5043.306 | 4939.212 | 4878.176 | 5904.683 | 4769.26 | 5344.706 | 4782.277 | 4624.01 | 5138.195 |
| 187 | 5886.42 | 5153.297 | 4942.671 | 5038.275 | 4740.244 | 5043.306 | 4938.612 | 4870.244 | 5904.683 | 4769.26 | 5344.706 | 4782.277 | 4624.01 | 5138.195 |
| 188 | 5886.42 | 5153.297 | 4942.671 | 5038.275 | 4740.244 | 5043.306 | 4938.012 | 4862.338 | 5904.683 | 4769.26 | 5344.706 | 4782.277 | 4624.01 | 5138.195 |
| 189 | 5886.42 | 5153.297 | 4942.671 | 5038.275 | 4740.244 | 5043.306 | 4937.412 | 4853.333 | 5904.683 | 4769.26 | 5344.706 | 4782.277 | 4624.01 | 5138.195 |
| 190 | 5886.42 | 5153.297 | 4942.671 | 5038.275 | 4740.244 | 5043.306 | 4936.812 | 4845.482 | 5904.683 | 4769.26 | 5344.706 | 4782.277 | 4624.01 | 5138.195 |
| 191 | 5886.42 | 5153.297 | 4942.671 | 5038.275 | 4740.244 | 5043.306 | 4936.213 | 4837.656 | 5904.683 | 4769.26 | 5344.706 | 4782.277 | 4624.01 | 5138.195 |
| 192 | 5886.42 | 5153.297 | 4942.671 | 5038.275 | 4740.244 | 5043.306 | 4935.613 | 4828.743 | 5904.683 | 4769.26 | 5344.706 | 4782.277 | 4624.01 | 5138.195 |
| 193 | 5886.42 | 5153.297 | 4942.671 | 5038.275 | 4740.244 | 5043.306 | 4935.014 | 4820.97 | 5904.683 | 4769.26 | 5344.706 | 4782.277 | 4624.01 | 5138.195 |
| 194 | 5886.42 | 5153.297 | 4942.671 | 5038.275 | 4740.244 | 5043.306 | 4934.415 | 4812.118 | 5904.683 | 4769.26 | 5344.706 | 4782.277 | 4624.01 | 5138.195 |
| 195 | 5886.42 | 5153.297 | 4942.671 | 5038.275 | 4740.244 | 5043.306 | 4933.816 | 4803.299 | 5904.683 | 4769.26 | 5344.706 | 4782.277 | 4624.01 | 5138.195 |
| 196 | 5886.42 | 5153.297 | 4942.671 | 5038.275 | 4740.244 | 5043.306 | 4933.217 | 4794.512 | 5904.683 | 4769.26 | 5344.706 | 4782.277 | 4624.01 | 5138.195 |
| 197 | 5886.42 | 5153.297 | 4942.671 | 5038.275 | 4740.244 | 5043.306 | 4932.619 | 4785.757 | 5904.683 | 4769.26 | 5344.706 | 4782.277 | 4624.01 | 5138.195 |
| 198 | 5886.42 | 5153.297 | 4942.671 | 5038.275 | 4740.244 | 5043.306 | 4932.02 | 4777.033 | 5904.683 | 4769.26 | 5344.706 | 4782.277 | 4624.01 | 5138.195 |
| 199 | 5886.42 | 5153.297 | 4942.671 | 5038.275 | 4740.244 | 5043.306 | 4931.422 | 4768.342 | 5904.683 | 4769.26 | 5344.706 | 4782.277 | 4624.01 | 5138.195 |
| 200 | 5886.42 | 5153.297 | 4942.671 | 5038.275 | 4740.244 | 5043.306 | 4930.824 | 4759.682 | 5904.683 | 4769.26 | 5344.706 | 4782.277 | 4624.01 | 5138.195 |
| 201 | 5886.42 | 5153.297 | 4942.671 | 5038.275 | 4740.244 | 5043.306 | 4930.226 | 4749.977 | 5904.683 | 4769.26 | 5344.706 | 4782.277 | 4624.01 | 5138.195 |
| 202 | 5886.42 | 5153.297 | 4942.671 | 5038.275 | 4740.244 | 5043.306 | 4929.628 | 4741.384 | 5904.683 | 4769.26 | 5344.706 | 4782.277 | 4624.01 | 5138.195 |
| 203 | 5886.42 | 5153.297 | 4942.671 | 5038.275 | 4740.244 | 5043.306 | 4929.03 | 4731.754 | 5904.683 | 4769.26 | 5344.706 | 4782.277 | 4624.01 | 5138.195 |
| 204 | 5886.42 | 5153.297 | 4942.671 | 5038.275 | 4740.244 | 5043.306 | 4928.433 | 4722.162 | 5904.683 | 4769.26 | 5344.706 | 4782.277 | 4624.01 | 5138.195 |
| 205 | 5886.42 | 5153.297 | 4942.671 | 5038.275 | 4740.244 | 5043.306 | 4927.835 | 4712.61 | 5904.683 | 4769.26 | 5344.706 | 4782.277 | 4624.01 | 5138.195 |
| 206 | 5886.42 | 5153.297 | 4942.671 | 5038.275 | 4740.244 | 5043.306 | 4927.238 | 4703.096 | 5904.683 | 4769.26 | 5344.706 | 4782.277 | 4624.01 | 5138.195 |
| 207 | 5886.42 | 5153.297 | 4942.671 | 5038.275 | 4740.244 | 5043.306 | 4926.641 | 4692.569 | 5904.683 | 4769.26 | 5344.706 | 4782.277 | 4624.01 | 5138.195 |
| 208 | 5886.42 | 5153.297 | 4942.671 | 5038.275 | 4740.244 | 5043.306 | 4926.044 | 4683.136 | 5904.683 | 4769.26 | 5344.706 | 4782.277 | 4624.01 | 5138.195 |
| 209 | 5886.42 | 5153.297 | 4942.671 | 5038.275 | 4740.244 | 5043.306 | 4925.447 | 4672.699 | 5904.683 | 4769.26 | 5344.706 | 4782.277 | 4624.01 | 5138.195 |
| 210 | 5886.42 | 5153.297 | 4942.671 | 5038.275 | 4740.244 | 5043.306 | 4924.85 | 4663.345 | 5904.683 | 4769.26 | 5344.706 | 4782.277 | 4624.01 | 5138.195 |
| 211 | 5886.42 | 5153.297 | 4942.671 | 5038.275 | 4740.244 | 5043.306 | 4924.253 | 4652.996 | 5904.683 | 4769.26 | 5344.706 | 4782.277 | 4624.01 | 5138.195 |
| 212 | 5886.42 | 5153.297 | 4942.671 | 5038.275 | 4740.244 | 5043.306 | 4923.657 | 4642.693 | 5904.683 | 4769.26 | 5344.706 | 4782.277 | 4624.01 | 5138.195 |
| 213 | 5886.42 | 5153.297 | 4942.671 | 5038.275 | 4740.244 | 5043.306 | 4923.061 | 4632.435 | 5904.683 | 4769.26 | 5344.706 | 4782.277 | 4624.01 | 5138.195 |
| 214 | 5886.42 | 5153.297 | 4942.671 | 5038.275 | 4740.244 | 5043.306 | 4922.464 | 4621.203 | 5904.683 | 4769.26 | 5344.706 | 4782.277 | 4624.01 | 5138.195 |
| 215 | 5886.42 | 5153.297 | 4942.671 | 5038.275 | 4740.244 | 5043.306 | 4921.868 | 4611.04 | 5904.683 | 4769.26 | 5344.706 | 4782.277 | 4624.01 | 5138.195 |
| 216 | 5886.42 | 5153.297 | 4942.671 | 5038.275 | 4740.244 | 5043.306 | 4921.273 | 4599.912 | 5904.683 | 4769.26 | 5344.706 | 4782.277 | 4624.01 | 5138.195 |
| 217 | 5886.42 | 5153.297 | 4942.671 | 5038.275 | 4740.244 | 5043.306 | 4920.677 | 4588.838 | 5904.683 | 4769.26 | 5344.706 | 4782.277 | 4624.01 | 5138.195 |
| 218 | 5886.42 | 5153.297 | 4942.671 | 5038.275 | 4740.244 | 5043.306 | 4920.081 | 4577.817 | 5904.683 | 4769.26 | 5344.706 | 4782.277 | 4624.01 | 5138.195 |
| 219 | 5886.42 | 5153.297 | 4942.671 | 5038.275 | 4740.244 | 5043.306 | 4919.486 | 4566.848 | 5904.683 | 4769.26 | 5344.706 | 4782.277 | 4624.01 | 5138.195 |
| 220 | 5886.42 | 5153.297 | 4942.671 | 5038.275 | 4740.244 | 5043.306 | 4918.891 | 4555.932 | 5904.683 | 4769.26 | 5344.706 | 4782.277 | 4624.01 | 5138.195 |
| 221 | 5886.42 | 5153.297 | 4942.671 | 5038.275 | 4740.244 | 5043.306 | 4918.295 | 4544.083 | 5904.683 | 4769.26 | 5344.706 | 4782.277 | 4624.01 | 5138.195 |
| 222 | 5886.42 | 5153.297 | 4942.671 | 5038.275 | 4740.244 | 5043.306 | 4917.7 | 4532.296 | 5904.683 | 4769.26 | 5344.706 | 4782.277 | 4624.01 | 5138.195 |
| 223 | 5886.42 | 5153.297 | 4942.671 | 5038.275 | 4740.244 | 5043.306 | 4917.106 | 4521.544 | 5904.683 | 4769.26 | 5344.706 | 4782.277 | 4624.01 | 5138.195 |
| 224 | 5886.42 | 5153.297 | 4942.671 | 5038.275 | 4740.244 | 5043.306 | 4916.511 | 4509.873 | 5904.683 | 4769.26 | 5344.706 | 4782.277 | 4624.01 | 5138.195 |
| 225 | 5886.42 | 5153.297 | 4942.671 | 5038.275 | 4740.244 | 5043.306 | 4915.916 | 4497.297 | 5904.683 | 4769.26 | 5344.706 | 4782.277 | 4624.01 | 5138.195 |
| 226 | 5886.42 | 5153.297 | 4942.671 | 5038.275 | 4740.244 | 5043.306 | 4915.322 | 4485.751 | 5904.683 | 4769.26 | 5344.706 | 4782.277 | 4624.01 | 5138.195 |
| 227 | 5886.42 | 5153.297 | 4942.671 | 5038.275 | 4740.244 | 5043.306 | 4914.728 | 4473.309 | 5904.683 | 4769.26 | 5344.706 | 4782.277 | 4624.01 | 5138.195 |
| 228 | 5886.42 | 5153.297 | 4942.671 | 5038.275 | 4740.244 | 5043.306 | 4914.133 | 4460.936 | 5904.683 | 4769.26 | 5344.706 | 4782.277 | 4624.01 | 5138.195 |
| 229 | 5886.42 | 5153.297 | 4942.671 | 5038.275 | 4740.244 | 5043.306 | 4913.539 | 4448.631 | 5904.683 | 4769.26 | 5344.706 | 4782.277 | 4624.01 | 5138.195 |
| 230 | 5886.42 | 5153.297 | 4942.671 | 5038.275 | 4740.244 | 5043.306 | 4912.946 | 4436.394 | 5904.683 | 4769.26 | 5344.706 | 4782.277 | 4624.01 | 5138.195 |
| 231 | 5886.42 | 5153.297 | 4942.671 | 5038.275 | 4740.244 | 5043.306 | 4912.352 | 4424.225 | 5904.683 | 4769.26 | 5344.706 | 4782.277 | 4624.01 | 5138.195 |
| 232 | 5886.42 | 5153.297 | 4942.671 | 5038.275 | 4740.244 | 5043.306 | 4911.758 | 4411.193 | 5904.683 | 4769.26 | 5344.706 | 4782.277 | 4624.01 | 5138.195 |
| 233 | 5886.42 | 5153.297 | 4942.671 | 5038.275 | 4740.244 | 5043.306 | 4911.165 | 4398.238 | 5904.683 | 4769.26 | 5344.706 | 4782.277 | 4624.01 | 5138.195 |
| 234 | 5886.42 | 5153.297 | 4942.671 | 5038.275 | 4740.244 | 5043.306 | 4910.572 | 4385.359 | 5904.683 | 4769.26 | 5344.706 | 4782.277 | 4624.01 | 5138.195 |
| 235 | 5886.42 | 5153.297 | 4942.671 | 5038.275 | 4740.244 | 5043.306 | 4909.978 | 4372.555 | 5904.683 | 4769.26 | 5344.706 | 4782.277 | 4624.01 | 5138.195 |
| 236 | 5886.42 | 5153.297 | 4942.671 | 5038.275 | 4740.244 | 5043.306 | 4909.385 | 4358.919 | 5904.683 | 4769.26 | 5344.706 | 4782.277 | 4624.01 | 5138.195 |
| 237 | 5886.42 | 5153.297 | 4942.671 | 5038.275 | 4740.244 | 5043.306 | 4908.793 | 4345.368 | 5904.683 | 4769.26 | 5344.706 | 4782.277 | 4624.01 | 5138.195 |
| 238 | 5886.42 | 5153.297 | 4942.671 | 5038.275 | 4740.244 | 5043.306 | 4908.2 | 4332.796 | 5904.683 | 4769.26 | 5344.706 | 4782.277 | 4624.01 | 5138.195 |
| 239 | 5886.42 | 5153.297 | 4942.671 | 5038.275 | 4740.244 | 5043.306 | 4907.607 | 4318.517 | 5904.683 | 4769.26 | 5344.706 | 4782.277 | 4624.01 | 5138.195 |
| 240 | 5886.42 | 5153.297 | 4942.671 | 5038.275 | 4740.244 | 5043.306 | 4907.015 | 4305.216 | 5904.683 | 4769.26 | 5344.706 | 4782.277 | 4624.01 | 5138.195 |
| 241 | 5886.42 | 5153.297 | 4942.671 | 5038.275 | 4740.244 | 5043.306 | 4906.423 | 4291.117 | 5904.683 | 4769.26 | 5344.706 | 4782.277 | 4624.01 | 5138.195 |
| 242 | 5886.42 | 5153.297 | 4942.671 | 5038.275 | 4740.244 | 5043.306 | 4905.831 | 4277.111 | 5904.683 | 4769.26 | 5344.706 | 4782.277 | 4624.01 | 5138.195 |
| 243 | 5886.42 | 5153.297 | 4942.671 | 5038.275 | 4740.244 | 5043.306 | 4905.239 | 4263.196 | 5904.683 | 4769.26 | 5344.706 | 4782.277 | 4624.01 | 5138.195 |
| 244 | 5886.42 | 5153.297 | 4942.671 | 5038.275 | 4740.244 | 5043.306 | 4904.647 | 4249.372 | 5904.683 | 4769.26 | 5344.706 | 4782.277 | 4624.01 | 5138.195 |
| 245 | 5886.42 | 5153.297 | 4942.671 | 5038.275 | 4740.244 | 5043.306 | 4904.055 | 4234.781 | 5904.683 | 4769.26 | 5344.706 | 4782.277 | 4624.01 | 5138.195 |
| 246 | 5886.42 | 5153.297 | 4942.671 | 5038.275 | 4740.244 | 5043.306 | 4903.463 | 4221.14 | 5904.683 | 4769.26 | 5344.706 | 4782.277 | 4624.01 | 5138.195 |
| 247 | 5886.42 | 5153.297 | 4942.671 | 5038.275 | 4740.244 | 5043.306 | 4902.872 | 4206.742 | 5904.683 | 4769.26 | 5344.706 | 4782.277 | 4624.01 | 5138.195 |
| 248 | 5886.42 | 5153.297 | 4942.671 | 5038.275 | 4740.244 | 5043.306 | 4902.281 | 4191.603 | 5904.683 | 4769.26 | 5344.706 | 4782.277 | 4624.01 | 5138.195 |
| 249 | 5886.42 | 5153.297 | 4942.671 | 5038.275 | 4740.244 | 5043.306 | 4901.69 | 4177.406 | 5904.683 | 4769.26 | 5344.706 | 4782.277 | 4624.01 | 5138.195 |
| 250 | 5886.42 | 5153.297 | 4942.671 | 5038.275 | 4740.244 | 5043.306 | 4901.099 | 4177.406 | 5904.683 | 4769.26 | 5344.706 | 4782.277 | 4624.01 | 5138.195 |
| 251 | 5886.42 | 5153.297 | 4942.671 | 5038.275 | 4740.244 | 5043.306 | 4900.508 | 4177.406 | 5904.683 | 4769.26 | 5344.706 | 4782.277 | 4624.01 | 5138.195 |
| 252 | 5886.42 | 5153.297 | 4942.671 | 5038.275 | 4740.244 | 5043.306 | 4899.917 | 4177.406 | 5904.683 | 4769.26 | 5344.706 | 4782.277 | 4624.01 | 5138.195 |
| 253 | 5886.42 | 5153.297 | 4942.671 | 5038.275 | 4740.244 | 5043.306 | 4899.326 | 4177.406 | 5904.683 | 4769.26 | 5344.706 | 4782.277 | 4624.01 | 5138.195 |
| 254 | 5886.42 | 5153.297 | 4942.671 | 5038.275 | 4740.244 | 5043.306 | 4898.736 | 4177.406 | 5904.683 | 4769.26 | 5344.706 | 4782.277 | 4624.01 | 5138.195 |
| 255 | 5886.42 | 5153.297 | 4942.671 | 5038.275 | 4740.244 | 5043.306 | 4898.146 | 4177.406 | 5904.683 | 4769.26 | 5344.706 | 4782.277 | 4624.01 | 5138.195 |
| 256 | 5886.42 | 5153.297 | 4942.671 | 5038.275 | 4740.244 | 5043.306 | 4897.556 | 4177.406 | 5904.683 | 4769.26 | 5344.706 | 4782.277 | 4624.01 | 5138.195 |
| 257 | 5886.42 | 5153.297 | 4942.671 | 5038.275 | 4740.244 | 5043.306 | 4896.966 | 4177.406 | 5904.683 | 4769.26 | 5344.706 | 4782.277 | 4624.01 | 5138.195 |
| 258 | 5886.42 | 5153.297 | 4942.671 | 5038.275 | 4740.244 | 5043.306 | 4896.376 | 4177.406 | 5904.683 | 4769.26 | 5344.706 | 4782.277 | 4624.01 | 5138.195 |
| 259 | 5886.42 | 5153.297 | 4942.671 | 5038.275 | 4740.244 | 5043.306 | 4895.786 | 4177.406 | 5904.683 | 4769.26 | 5344.706 | 4782.277 | 4624.01 | 5138.195 |
| 260 | 5886.42 | 5153.297 | 4942.671 | 5038.275 | 4740.244 | 5043.306 | 4895.196 | 4177.406 | 5904.683 | 4769.26 | 5344.706 | 4782.277 | 4624.01 | 5138.195 |
| 261 | 5886.42 | 5153.297 | 4942.671 | 5038.275 | 4740.244 | 5043.306 | 4894.607 | 4177.406 | 5904.683 | 4769.26 | 5344.706 | 4782.277 | 4624.01 | 5138.195 |
| 262 | 5886.42 | 5153.297 | 4942.671 | 5038.275 | 4740.244 | 5043.306 | 4894.018 | 4177.406 | 5904.683 | 4769.26 | 5344.706 | 4782.277 | 4624.01 | 5138.195 |
| 263 | 5886.42 | 5153.297 | 4942.671 | 5038.275 | 4740.244 | 5043.306 | 4893.429 | 4177.406 | 5904.683 | 4769.26 | 5344.706 | 4782.277 | 4624.01 | 5138.195 |
| 264 | 5886.42 | 5153.297 | 4942.671 | 5038.275 | 4740.244 | 5043.306 | 4892.84 | 4177.406 | 5904.683 | 4769.26 | 5344.706 | 4782.277 | 4624.01 | 5138.195 |
| 265 | 5886.42 | 5153.297 | 4942.671 | 5038.275 | 4740.244 | 5043.306 | 4892.251 | 4177.406 | 5904.683 | 4769.26 | 5344.706 | 4782.277 | 4624.01 | 5138.195 |
| 266 | 5886.42 | 5153.297 | 4942.671 | 5038.275 | 4740.244 | 5043.306 | 4891.662 | 4177.406 | 5904.683 | 4769.26 | 5344.706 | 4782.277 | 4624.01 | 5138.195 |
| 267 | 5886.42 | 5153.297 | 4942.671 | 5038.275 | 4740.244 | 5043.306 | 4891.073 | 4177.406 | 5904.683 | 4769.26 | 5344.706 | 4782.277 | 4624.01 | 5138.195 |
| 268 | 5886.42 | 5153.297 | 4942.671 | 5038.275 | 4740.244 | 5043.306 | 4890.485 | 4177.406 | 5904.683 | 4769.26 | 5344.706 | 4782.277 | 4624.01 | 5138.195 |
| 269 | 5886.42 | 5153.297 | 4942.671 | 5038.275 | 4740.244 | 5043.306 | 4889.897 | 4177.406 | 5904.683 | 4769.26 | 5344.706 | 4782.277 | 4624.01 | 5138.195 |
| 270 | 5886.42 | 5153.297 | 4942.671 | 5038.275 | 4740.244 | 5043.306 | 4889.309 | 4177.406 | 5904.683 | 4769.26 | 5344.706 | 4782.277 | 4624.01 | 5138.195 |
| 271 | 5886.42 | 5153.297 | 4942.671 | 5038.275 | 4740.244 | 5043.306 | 4888.721 | 4177.406 | 5904.683 | 4769.26 | 5344.706 | 4782.277 | 4624.01 | 5138.195 |
| 272 | 5886.42 | 5153.297 | 4942.671 | 5038.275 | 4740.244 | 5043.306 | 4888.133 | 4177.406 | 5904.683 | 4769.26 | 5344.706 | 4782.277 | 4624.01 | 5138.195 |
| 273 | 5886.42 | 5153.297 | 4942.671 | 5038.275 | 4740.244 | 5043.306 | 4887.545 | 4177.406 | 5904.683 | 4769.26 | 5344.706 | 4782.277 | 4624.01 | 5138.195 |
| 274 | 5886.42 | 5153.297 | 4942.671 | 5038.275 | 4740.244 | 5043.306 | 4886.957 | 4177.406 | 5904.683 | 4769.26 | 5344.706 | 4782.277 | 4624.01 | 5138.195 |
| 275 | 5886.42 | 5153.297 | 4942.671 | 5038.275 | 4740.244 | 5043.306 | 4886.37 | 4177.406 | 5904.683 | 4769.26 | 5344.706 | 4782.277 | 4624.01 | 5138.195 |
| 276 | 5886.42 | 5153.297 | 4942.671 | 5038.275 | 4740.244 | 5043.306 | 4885.783 | 4177.406 | 5904.683 | 4769.26 | 5344.706 | 4782.277 | 4624.01 | 5138.195 |
| 277 | 5886.42 | 5153.297 | 4942.671 | 5038.275 | 4740.244 | 5043.306 | 4885.195 | 4177.406 | 5904.683 | 4769.26 | 5344.706 | 4782.277 | 4624.01 | 5138.195 |
| 278 | 5886.42 | 5153.297 | 4942.671 | 5038.275 | 4740.244 | 5043.306 | 4884.608 | 4177.406 | 5904.683 | 4769.26 | 5344.706 | 4782.277 | 4624.01 | 5138.195 |
| 279 | 5886.42 | 5153.297 | 4942.671 | 5038.275 | 4740.244 | 5043.306 | 4884.022 | 4177.406 | 5904.683 | 4769.26 | 5344.706 | 4782.277 | 4624.01 | 5138.195 |
| 280 | 5886.42 | 5153.297 | 4942.671 | 5038.275 | 4740.244 | 5043.306 | 4883.435 | 4177.406 | 5904.683 | 4769.26 | 5344.706 | 4782.277 | 4624.01 | 5138.195 |
| 281 | 5886.42 | 5153.297 | 4942.671 | 5038.275 | 4740.244 | 5043.306 | 4882.848 | 4177.406 | 5904.683 | 4769.26 | 5344.706 | 4782.277 | 4624.01 | 5138.195 |
| 282 | 5886.42 | 5153.297 | 4942.671 | 5038.275 | 4740.244 | 5043.306 | 4882.262 | 4177.406 | 5904.683 | 4769.26 | 5344.706 | 4782.277 | 4624.01 | 5138.195 |
| 283 | 5886.42 | 5153.297 | 4942.671 | 5038.275 | 4740.244 | 5043.306 | 4881.675 | 4177.406 | 5904.683 | 4769.26 | 5344.706 | 4782.277 | 4624.01 | 5138.195 |
| 284 | 5886.42 | 5153.297 | 4942.671 | 5038.275 | 4740.244 | 5043.306 | 4881.089 | 4177.406 | 5904.683 | 4769.26 | 5344.706 | 4782.277 | 4624.01 | 5138.195 |
| 285 | 5886.42 | 5153.297 | 4942.671 | 5038.275 | 4740.244 | 5043.306 | 4880.503 | 4177.406 | 5904.683 | 4769.26 | 5344.706 | 4782.277 | 4624.01 | 5138.195 |
| 286 | 5886.42 | 5153.297 | 4942.671 | 5038.275 | 4740.244 | 5043.306 | 4879.917 | 4177.406 | 5904.683 | 4769.26 | 5344.706 | 4782.277 | 4624.01 | 5138.195 |
| 287 | 5886.42 | 5153.297 | 4942.671 | 5038.275 | 4740.244 | 5043.306 | 4879.332 | 4177.406 | 5904.683 | 4769.26 | 5344.706 | 4782.277 | 4624.01 | 5138.195 |
| 288 | 5886.42 | 5153.297 | 4942.671 | 5038.275 | 4740.244 | 5043.306 | 4878.746 | 4177.406 | 5904.683 | 4769.26 | 5344.706 | 4782.277 | 4624.01 | 5138.195 |
| 289 | 5886.42 | 5153.297 | 4942.671 | 5038.275 | 4740.244 | 5043.306 | 4878.161 | 4177.406 | 5904.683 | 4769.26 | 5344.706 | 4782.277 | 4624.01 | 5138.195 |
| 290 | 5886.42 | 5153.297 | 4942.671 | 5038.275 | 4740.244 | 5043.306 | 4877.575 | 4177.406 | 5904.683 | 4769.26 | 5344.706 | 4782.277 | 4624.01 | 5138.195 |
| 291 | 5886.42 | 5153.297 | 4942.671 | 5038.275 | 4740.244 | 5043.306 | 4876.99 | 4177.406 | 5904.683 | 4769.26 | 5344.706 | 4782.277 | 4624.01 | 5138.195 |
| 292 | 5886.42 | 5153.297 | 4942.671 | 5038.275 | 4740.244 | 5043.306 | 4876.405 | 4177.406 | 5904.683 | 4769.26 | 5344.706 | 4782.277 | 4624.01 | 5138.195 |
| 293 | 5886.42 | 5153.297 | 4942.671 | 5038.275 | 4740.244 | 5043.306 | 4875.82 | 4177.406 | 5904.683 | 4769.26 | 5344.706 | 4782.277 | 4624.01 | 5138.195 |
| 294 | 5886.42 | 5153.297 | 4942.671 | 5038.275 | 4740.244 | 5043.306 | 4875.235 | 4177.406 | 5904.683 | 4769.26 | 5344.706 | 4782.277 | 4624.01 | 5138.195 |
| 295 | 5886.42 | 5153.297 | 4942.671 | 5038.275 | 4740.244 | 5043.306 | 4874.651 | 4177.406 | 5904.683 | 4769.26 | 5344.706 | 4782.277 | 4624.01 | 5138.195 |
| 296 | 5886.42 | 5153.297 | 4942.671 | 5038.275 | 4740.244 | 5043.306 | 4874.066 | 4177.406 | 5904.683 | 4769.26 | 5344.706 | 4782.277 | 4624.01 | 5138.195 |
| 297 | 5886.42 | 5153.297 | 4942.671 | 5038.275 | 4740.244 | 5043.306 | 4873.482 | 4177.406 | 5904.683 | 4769.26 | 5344.706 | 4782.277 | 4624.01 | 5138.195 |
| 298 | 5886.42 | 5153.297 | 4942.671 | 5038.275 | 4740.244 | 5043.306 | 4872.898 | 4177.406 | 5904.683 | 4769.26 | 5344.706 | 4782.277 | 4624.01 | 5138.195 |
| 299 | 5886.42 | 5153.297 | 4942.671 | 5038.275 | 4740.244 | 5043.306 | 4872.314 | 4177.406 | 5904.683 | 4769.26 | 5344.706 | 4782.277 | 4624.01 | 5138.195 |